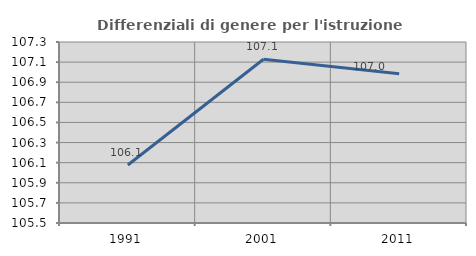
| Category | Differenziali di genere per l'istruzione superiore |
|---|---|
| 1991.0 | 106.077 |
| 2001.0 | 107.129 |
| 2011.0 | 106.985 |